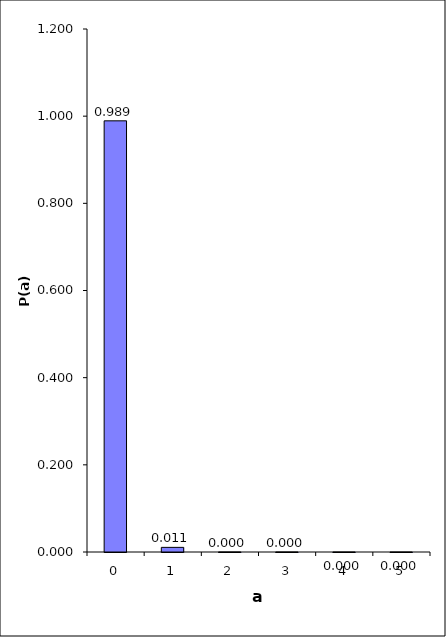
| Category | P(a) |
|---|---|
| 0.0 | 0.989 |
| 1.0 | 0.011 |
| 2.0 | 0 |
| 3.0 | 0 |
| 4.0 | 0 |
| 5.0 | 0 |